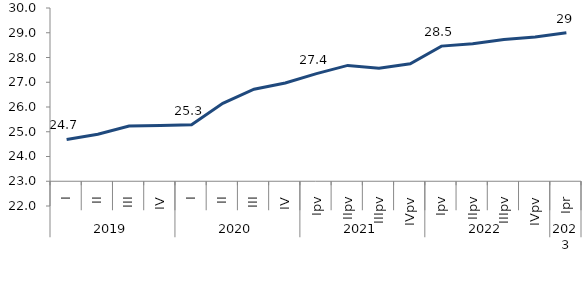
| Category | Series 0 |
|---|---|
| 0 | 24.69 |
| 1900-01-01 | 24.9 |
| 1900-01-02 | 25.23 |
| 1900-01-03 | 25.25 |
| 1900-01-04 | 25.28 |
| 1900-01-05 | 26.15 |
| 1900-01-06 | 26.72 |
| 1900-01-07 | 26.97 |
| 1900-01-08 | 27.35 |
| 1900-01-09 | 27.68 |
| 1900-01-10 | 27.57 |
| 1900-01-11 | 27.75 |
| 1900-01-12 | 28.46 |
| 1900-01-13 | 28.56 |
| 1900-01-14 | 28.73 |
| 1900-01-15 | 28.83 |
| 1900-01-16 | 29 |